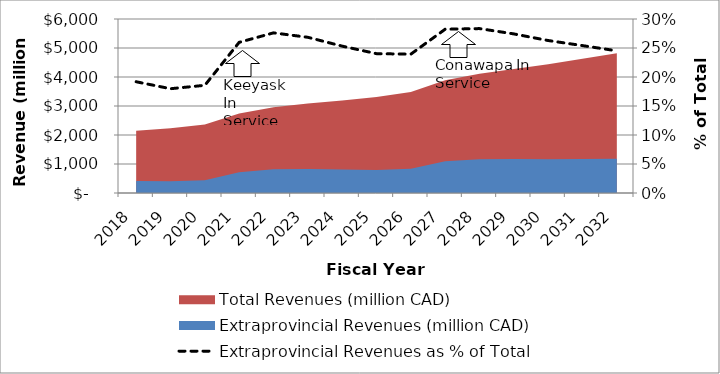
| Category | Extraprovincial Revenues as % of Total |
|---|---|
| 0 | 0.192 |
| 1 | 0.18 |
| 2 | 0.186 |
| 3 | 0.26 |
| 4 | 0.276 |
| 5 | 0.268 |
| 6 | 0.253 |
| 7 | 0.24 |
| 8 | 0.239 |
| 9 | 0.282 |
| 10 | 0.283 |
| 11 | 0.274 |
| 12 | 0.263 |
| 13 | 0.254 |
| 14 | 0.245 |